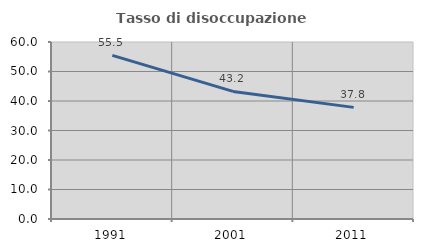
| Category | Tasso di disoccupazione giovanile  |
|---|---|
| 1991.0 | 55.455 |
| 2001.0 | 43.243 |
| 2011.0 | 37.838 |